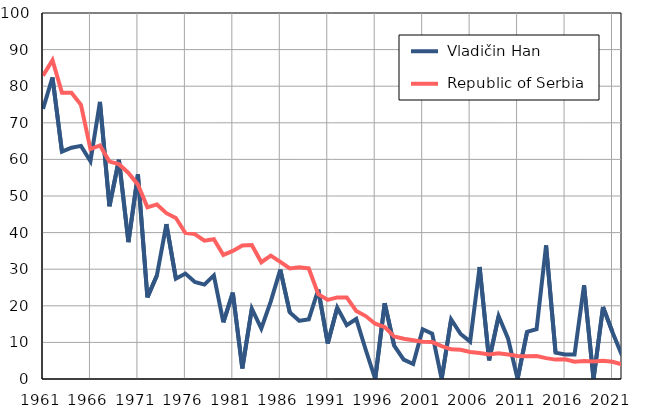
| Category |  Vladičin Han |  Republic of Serbia |
|---|---|---|
| 1961.0 | 73.8 | 82.9 |
| 1962.0 | 82.4 | 87.1 |
| 1963.0 | 62.1 | 78.2 |
| 1964.0 | 63.2 | 78.2 |
| 1965.0 | 63.7 | 74.9 |
| 1966.0 | 59.5 | 62.8 |
| 1967.0 | 75.7 | 63.8 |
| 1968.0 | 47.2 | 59.4 |
| 1969.0 | 59.9 | 58.7 |
| 1970.0 | 37.4 | 56.3 |
| 1971.0 | 55.9 | 53.1 |
| 1972.0 | 22.3 | 46.9 |
| 1973.0 | 28.3 | 47.7 |
| 1974.0 | 42.3 | 45.3 |
| 1975.0 | 27.4 | 44 |
| 1976.0 | 28.8 | 39.9 |
| 1977.0 | 26.5 | 39.6 |
| 1978.0 | 25.8 | 37.8 |
| 1979.0 | 28.3 | 38.2 |
| 1980.0 | 15.5 | 33.9 |
| 1981.0 | 23.6 | 35 |
| 1982.0 | 2.9 | 36.5 |
| 1983.0 | 19.2 | 36.6 |
| 1984.0 | 13.8 | 31.9 |
| 1985.0 | 21.2 | 33.7 |
| 1986.0 | 29.9 | 32 |
| 1987.0 | 18.2 | 30.2 |
| 1988.0 | 15.9 | 30.5 |
| 1989.0 | 16.3 | 30.2 |
| 1990.0 | 24.4 | 23.2 |
| 1991.0 | 9.7 | 21.6 |
| 1992.0 | 19.5 | 22.3 |
| 1993.0 | 14.7 | 22.3 |
| 1994.0 | 16.4 | 18.6 |
| 1995.0 | 8 | 17.2 |
| 1996.0 | 0 | 15.1 |
| 1997.0 | 20.7 | 14.2 |
| 1998.0 | 9.1 | 11.6 |
| 1999.0 | 5.3 | 11 |
| 2000.0 | 4.1 | 10.6 |
| 2001.0 | 13.6 | 10.2 |
| 2002.0 | 12.4 | 10.1 |
| 2003.0 | 0 | 9 |
| 2004.0 | 16.3 | 8.1 |
| 2005.0 | 12.3 | 8 |
| 2006.0 | 10.2 | 7.4 |
| 2007.0 | 30.6 | 7.1 |
| 2008.0 | 5.1 | 6.7 |
| 2009.0 | 17.2 | 7 |
| 2010.0 | 11 | 6.7 |
| 2011.0 | 0 | 6.3 |
| 2012.0 | 12.9 | 6.2 |
| 2013.0 | 13.6 | 6.3 |
| 2014.0 | 36.5 | 5.7 |
| 2015.0 | 7.2 | 5.3 |
| 2016.0 | 6.7 | 5.4 |
| 2017.0 | 6.7 | 4.7 |
| 2018.0 | 25.6 | 4.9 |
| 2019.0 | 0 | 4.8 |
| 2020.0 | 19.7 | 5 |
| 2021.0 | 12.8 | 4.7 |
| 2022.0 | 6.4 | 4 |